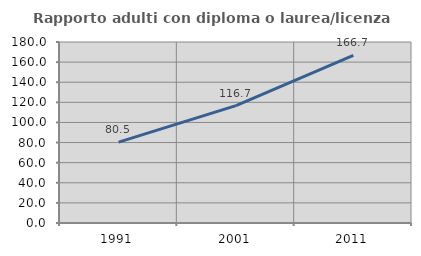
| Category | Rapporto adulti con diploma o laurea/licenza media  |
|---|---|
| 1991.0 | 80.488 |
| 2001.0 | 116.667 |
| 2011.0 | 166.667 |